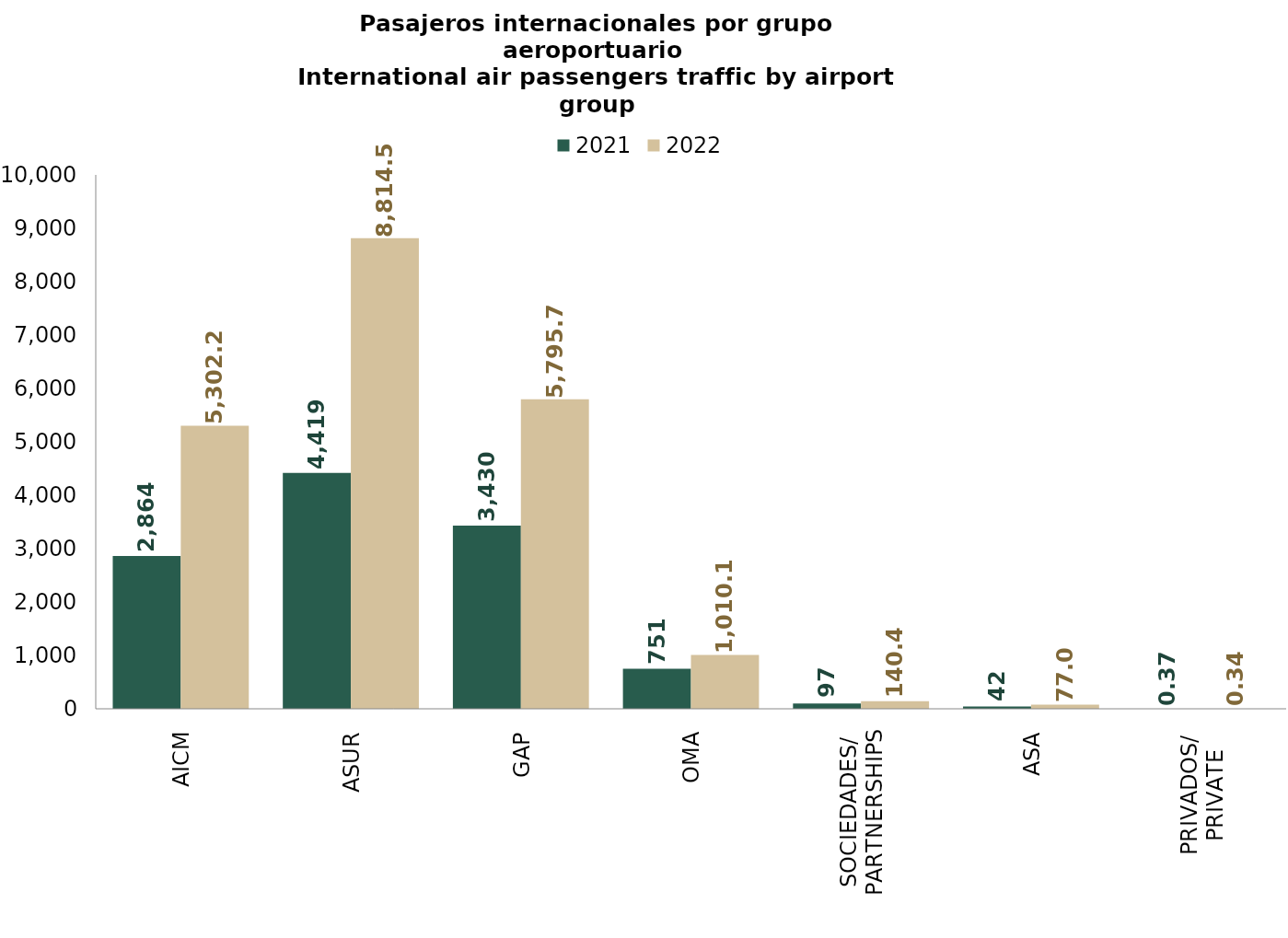
| Category | 2021 | 2022 |
|---|---|---|
| AICM | 2863.503 | 5302.186 |
| ASUR | 4419.447 | 8814.527 |
| GAP | 3429.812 | 5795.711 |
| OMA | 751.235 | 1010.114 |
| SOCIEDADES/
PARTNERSHIPS | 97.264 | 140.406 |
| ASA | 42.291 | 76.96 |
| PRIVADOS/
PRIVATE | 0.372 | 0.34 |